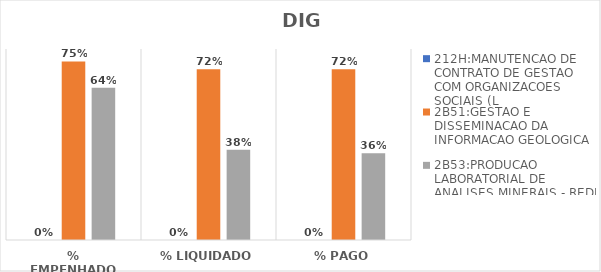
| Category | 212H:MANUTENCAO DE CONTRATO DE GESTAO COM ORGANIZACOES SOCIAIS (L | 2B51:GESTAO E DISSEMINACAO DA INFORMACAO GEOLOGICA | 2B53:PRODUCAO LABORATORIAL DE ANALISES MINERAIS - REDE LAMIN |
|---|---|---|---|
| % EMPENHADO | 0 | 0.748 | 0.637 |
| % LIQUIDADO | 0 | 0.715 | 0.378 |
| % PAGO | 0 | 0.715 | 0.364 |